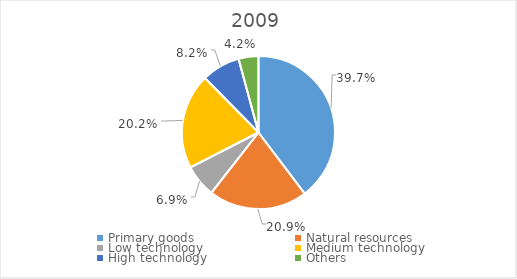
| Category | Series 0 |
|---|---|
| Primary goods | 0.397 |
| Natural resources | 0.209 |
| Low technology | 0.069 |
| Medium technology | 0.202 |
| High technology | 0.082 |
| Others | 0.042 |